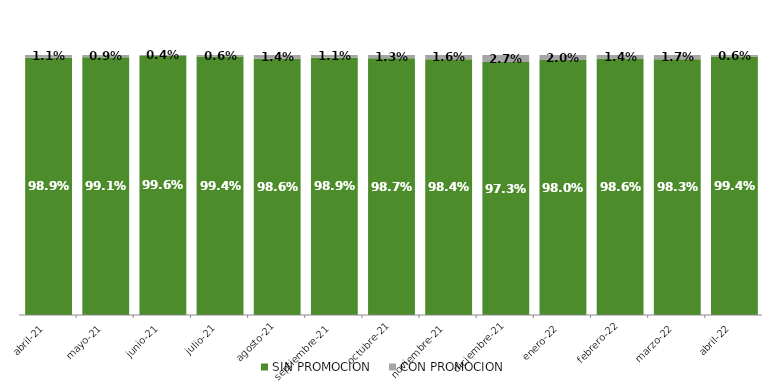
| Category | SIN PROMOCION   | CON PROMOCION   |
|---|---|---|
| 2021-04-01 | 0.989 | 0.011 |
| 2021-05-01 | 0.991 | 0.009 |
| 2021-06-01 | 0.996 | 0.004 |
| 2021-07-01 | 0.994 | 0.006 |
| 2021-08-01 | 0.986 | 0.014 |
| 2021-09-01 | 0.989 | 0.011 |
| 2021-10-01 | 0.987 | 0.013 |
| 2021-11-01 | 0.984 | 0.016 |
| 2021-12-01 | 0.973 | 0.027 |
| 2022-01-01 | 0.98 | 0.02 |
| 2022-02-01 | 0.986 | 0.014 |
| 2022-03-01 | 0.983 | 0.017 |
| 2022-04-01 | 0.994 | 0.006 |